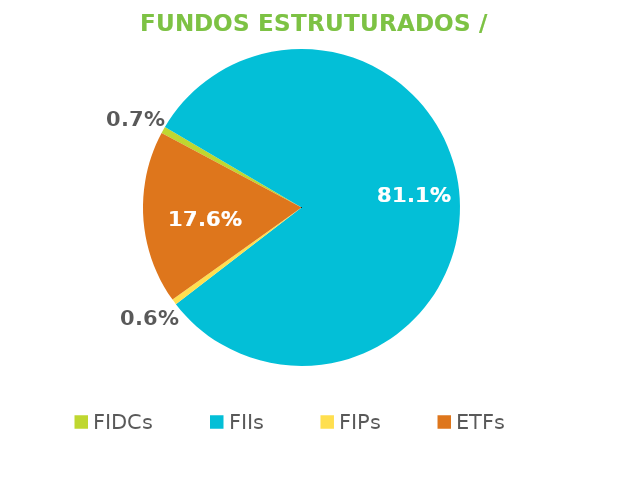
| Category | Fundos Estruturados / ETFs |
|---|---|
| FIDCs | 0.007 |
| FIIs | 0.811 |
| FIPs | 0.006 |
| ETFs | 0.176 |